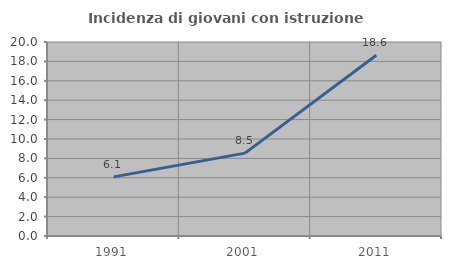
| Category | Incidenza di giovani con istruzione universitaria |
|---|---|
| 1991.0 | 6.098 |
| 2001.0 | 8.543 |
| 2011.0 | 18.639 |